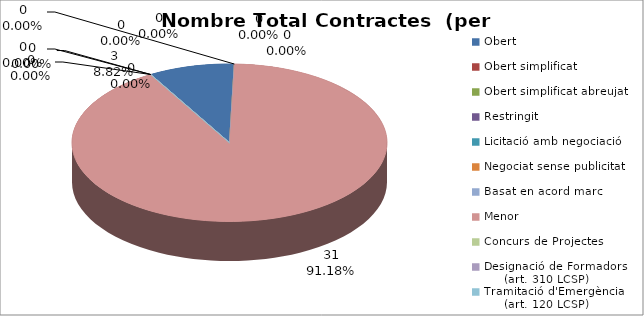
| Category | Nombre Total Contractes |
|---|---|
| Obert | 3 |
| Obert simplificat | 0 |
| Obert simplificat abreujat | 0 |
| Restringit | 0 |
| Licitació amb negociació | 0 |
| Negociat sense publicitat | 0 |
| Basat en acord marc | 0 |
| Menor | 31 |
| Concurs de Projectes | 0 |
| Designació de Formadors
     (art. 310 LCSP) | 0 |
| Tramitació d'Emergència
     (art. 120 LCSP) | 0 |